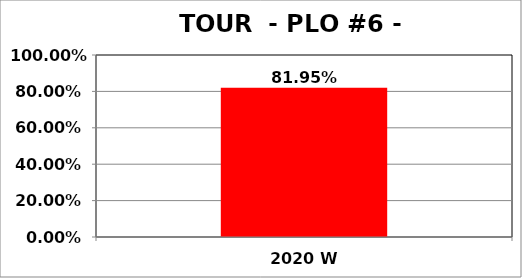
| Category | Series 0 |
|---|---|
| 2020 W | 0.82 |